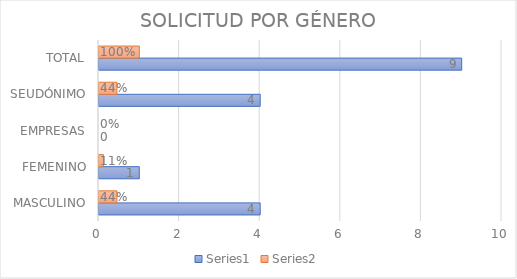
| Category | Series 0 | Series 1 |
|---|---|---|
| MASCULINO | 4 | 0.444 |
| FEMENINO | 1 | 0.111 |
| EMPRESAS | 0 | 0 |
| SEUDÓNIMO | 4 | 0.444 |
| TOTAL | 9 | 1 |